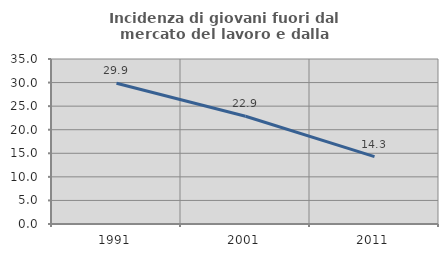
| Category | Incidenza di giovani fuori dal mercato del lavoro e dalla formazione  |
|---|---|
| 1991.0 | 29.87 |
| 2001.0 | 22.857 |
| 2011.0 | 14.286 |